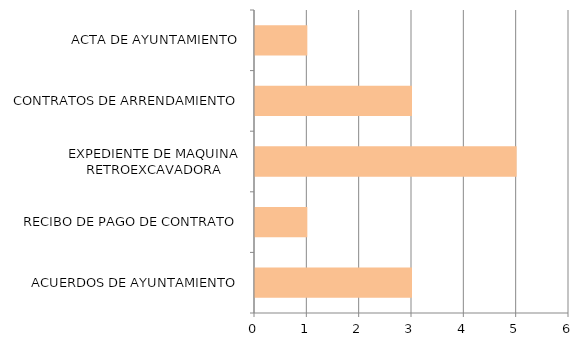
| Category | Series 0 |
|---|---|
| ACUERDOS DE AYUNTAMIENTO | 3 |
| RECIBO DE PAGO DE CONTRATO | 1 |
| EXPEDIENTE DE MAQUINA RETROEXCAVADORA | 5 |
| CONTRATOS DE ARRENDAMIENTO | 3 |
| ACTA DE AYUNTAMIENTO | 1 |